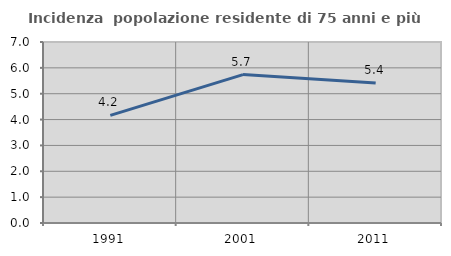
| Category | Incidenza  popolazione residente di 75 anni e più |
|---|---|
| 1991.0 | 4.163 |
| 2001.0 | 5.74 |
| 2011.0 | 5.412 |